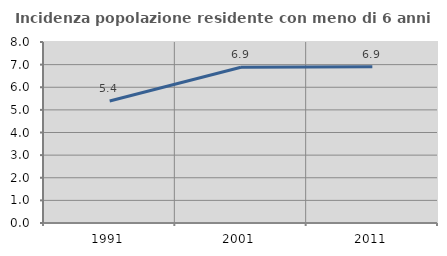
| Category | Incidenza popolazione residente con meno di 6 anni |
|---|---|
| 1991.0 | 5.396 |
| 2001.0 | 6.887 |
| 2011.0 | 6.905 |